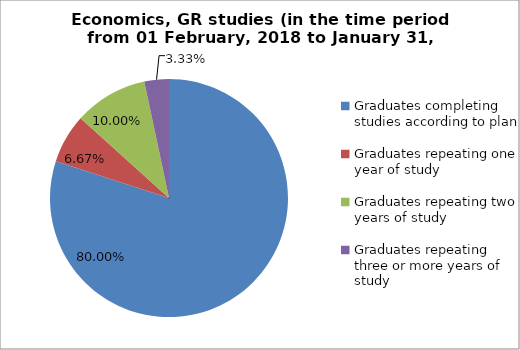
| Category | Series 0 |
|---|---|
| Graduates completing studies according to plan | 80 |
| Graduates repeating one year of study | 6.667 |
| Graduates repeating two years of study | 10 |
| Graduates repeating three or more years of study | 3.333 |